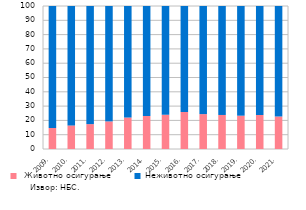
| Category |  Животно осигурање | Неживотно осигурање |
|---|---|---|
| 2009. | 14.7 | 85.3 |
| 2010. | 16.5 | 83.5 |
| 2011. | 17.4 | 82.6 |
| 2012. | 19.3 | 80.7 |
| 2013. | 22 | 78 |
| 2014. | 23.1 | 76.9 |
| 2015. | 23.9 | 76.1 |
| 2016. | 25.9 | 74.1 |
| 2017. | 24.4 | 75.6 |
| 2018. | 23.8 | 76.2 |
| 2019. | 23.3 | 76.7 |
| 2020. | 23.8 | 76.2 |
| 2021. | 22.7 | 77.3 |